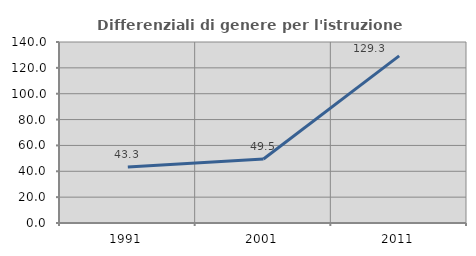
| Category | Differenziali di genere per l'istruzione superiore |
|---|---|
| 1991.0 | 43.313 |
| 2001.0 | 49.524 |
| 2011.0 | 129.295 |